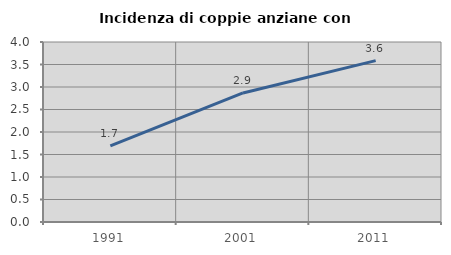
| Category | Incidenza di coppie anziane con figli |
|---|---|
| 1991.0 | 1.693 |
| 2001.0 | 2.867 |
| 2011.0 | 3.586 |